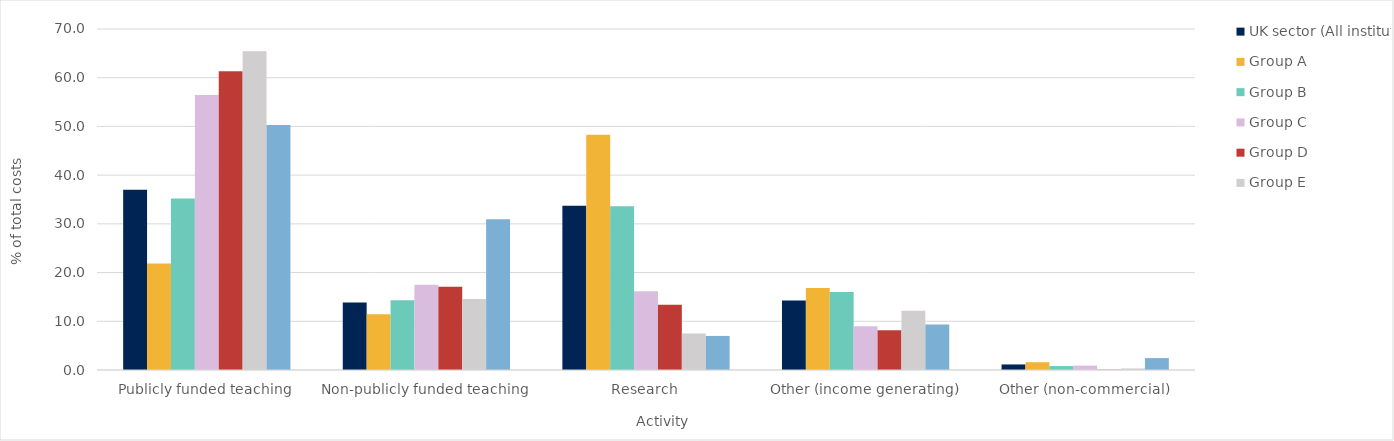
| Category | UK sector (All institutions) | Group A | Group B | Group C | Group D | Group E | Group F |
|---|---|---|---|---|---|---|---|
| 0 | 37.01 | 21.841 | 35.229 | 56.467 | 61.317 | 65.455 | 50.276 |
| 1 | 13.875 | 11.424 | 14.322 | 17.516 | 17.084 | 14.584 | 30.947 |
| 2 | 33.73 | 48.302 | 33.635 | 16.141 | 13.392 | 7.479 | 6.993 |
| 3 | 14.247 | 16.839 | 16.006 | 8.976 | 8.152 | 12.162 | 9.338 |
| 4 | 1.139 | 1.594 | 0.808 | 0.901 | 0.056 | 0.319 | 2.445 |